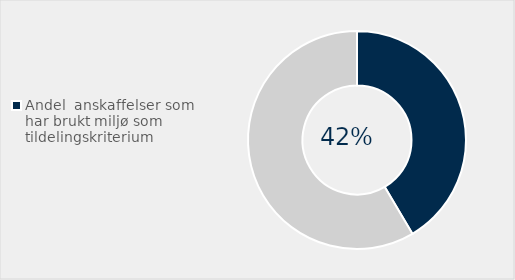
| Category | Series 0 |
|---|---|
| Andel  anskaffelser som har brukt miljø som tildelingskriterium | 0.415 |
| Ikke brukt miljø miljø som tildelingskritierum | 0.585 |